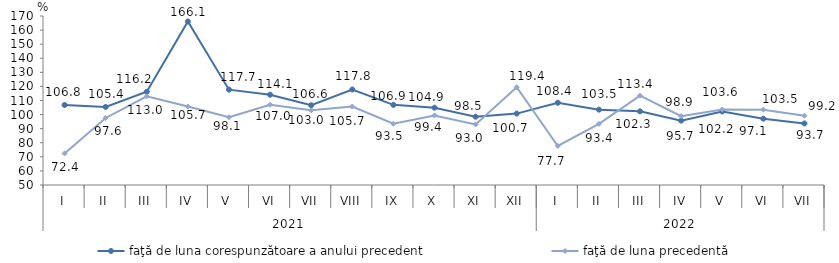
| Category | faţă de luna corespunzătoare a anului precedent | faţă de luna precedentă   |
|---|---|---|
| 0 | 106.8 | 72.4 |
| 1 | 105.4 | 97.6 |
| 2 | 116.2 | 113 |
| 3 | 166.1 | 105.7 |
| 4 | 117.7 | 98.1 |
| 5 | 114.1 | 107 |
| 6 | 106.6 | 103 |
| 7 | 117.8 | 105.7 |
| 8 | 106.9 | 93.5 |
| 9 | 104.9 | 99.4 |
| 10 | 98.5 | 93 |
| 11 | 100.7 | 119.4 |
| 12 | 108.4 | 77.7 |
| 13 | 103.5 | 93.4 |
| 14 | 102.3 | 113.4 |
| 15 | 95.7 | 98.9 |
| 16 | 102.2 | 103.6 |
| 17 | 97.1 | 103.5 |
| 18 | 93.7 | 99.2 |